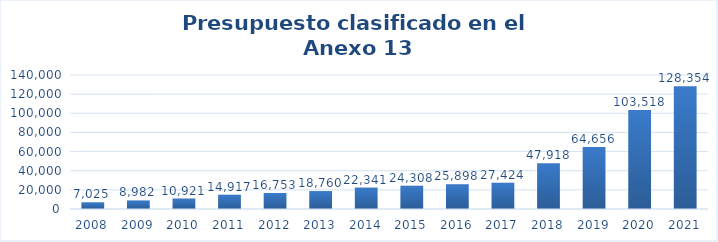
| Category | Presupuesto clasificado en el Anexo 13 |
|---|---|
| 2008.0 | 7025 |
| 2009.0 | 8982 |
| 2010.0 | 10921 |
| 2011.0 | 14917 |
| 2012.0 | 16753 |
| 2013.0 | 18760 |
| 2014.0 | 22341 |
| 2015.0 | 24308 |
| 2016.0 | 25898 |
| 2017.0 | 27424 |
| 2018.0 | 47918 |
| 2019.0 | 64656 |
| 2020.0 | 103518 |
| 2021.0 | 128354 |